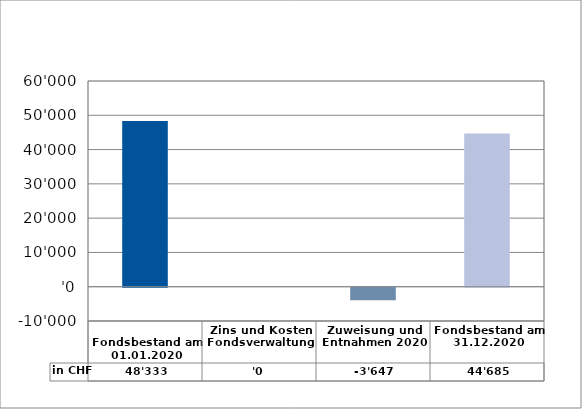
| Category | in CHF |
|---|---|
| 
Fondsbestand am 01.01.2020

 | 48332.77 |
| Zins und Kosten Fondsverwaltung | 0 |
| Zuweisung und Entnahmen 2020 | -3647.3 |
| Fondsbestand am 31.12.2020 | 44685.47 |